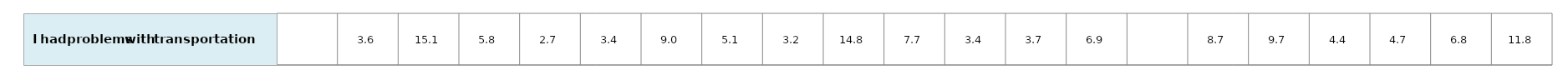
| Category | Series 0 |
|---|---|
| nan | 1 |
| 3.64870403352993 | 1 |
| 15.09329988916081 | 1 |
| 5.76077375124133 | 1 |
| 2.74984724668729 | 1 |
| 3.41112931379378 | 1 |
| 9.03989106281394 | 1 |
| 5.12395127478551 | 1 |
| 3.1897638142826903 | 1 |
| 14.82571820106317 | 1 |
| 7.66438495012957 | 1 |
| 3.38255592255339 | 1 |
| 3.67314812502542 | 1 |
| 6.865937024273404 | 1 |
| nan | 1 |
| 8.724462377914339 | 1 |
| 9.6631303308857 | 1 |
| 4.40266426239669 | 1 |
| 4.69495366302292 | 1 |
| 6.78206452792863 | 1 |
| 11.7564236897062 | 1 |